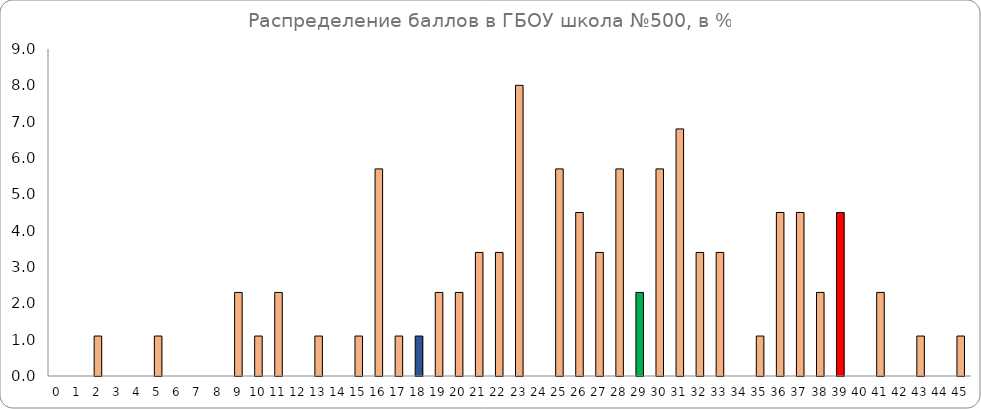
| Category | Series 0 |
|---|---|
| 0.0 | 0 |
| 1.0 | 0 |
| 2.0 | 1.1 |
| 3.0 | 0 |
| 4.0 | 0 |
| 5.0 | 1.1 |
| 6.0 | 0 |
| 7.0 | 0 |
| 8.0 | 0 |
| 9.0 | 2.3 |
| 10.0 | 1.1 |
| 11.0 | 2.3 |
| 12.0 | 0 |
| 13.0 | 1.1 |
| 14.0 | 0 |
| 15.0 | 1.1 |
| 16.0 | 5.7 |
| 17.0 | 1.1 |
| 18.0 | 1.1 |
| 19.0 | 2.3 |
| 20.0 | 2.3 |
| 21.0 | 3.4 |
| 22.0 | 3.4 |
| 23.0 | 8 |
| 24.0 | 0 |
| 25.0 | 5.7 |
| 26.0 | 4.5 |
| 27.0 | 3.4 |
| 28.0 | 5.7 |
| 29.0 | 2.3 |
| 30.0 | 5.7 |
| 31.0 | 6.8 |
| 32.0 | 3.4 |
| 33.0 | 3.4 |
| 34.0 | 0 |
| 35.0 | 1.1 |
| 36.0 | 4.5 |
| 37.0 | 4.5 |
| 38.0 | 2.3 |
| 39.0 | 4.5 |
| 40.0 | 0 |
| 41.0 | 2.3 |
| 42.0 | 0 |
| 43.0 | 1.1 |
| 44.0 | 0 |
| 45.0 | 1.1 |